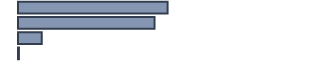
| Category | Series 0 |
|---|---|
| 0 | 48.1 |
| 1 | 43.9 |
| 2 | 7.6 |
| 3 | 0.3 |